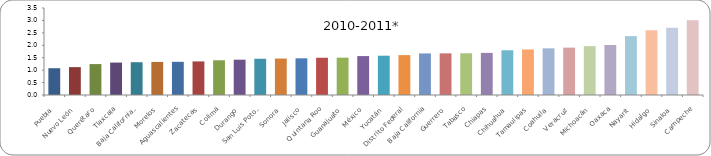
| Category | 2010-2011* |
|---|---|
| Puebla | 1.077 |
| Nuevo León | 1.121 |
| Querétaro | 1.244 |
| Tlaxcala | 1.305 |
| Baja California Sur | 1.319 |
| Morelos | 1.33 |
| Aguascalientes | 1.335 |
| Zacatecas | 1.351 |
| Colima | 1.398 |
| Durango | 1.421 |
| San Luis Potosí | 1.457 |
| Sonora | 1.467 |
| Jalisco | 1.476 |
| Quintana Roo | 1.499 |
| Guanajuato | 1.502 |
| México | 1.565 |
| Yucatán | 1.581 |
| Distrito Federal | 1.605 |
| Baja California | 1.673 |
| Guerrero | 1.676 |
| Tabasco | 1.679 |
| Chiapas | 1.694 |
| Chihuahua | 1.8 |
| Tamaulipas | 1.831 |
| Coahuila | 1.878 |
| Veracruz | 1.906 |
| Michoacán | 1.964 |
| Oaxaca | 2.011 |
| Nayarit | 2.37 |
| Hidalgo | 2.607 |
| Sinaloa | 2.701 |
| Campeche | 3.004 |